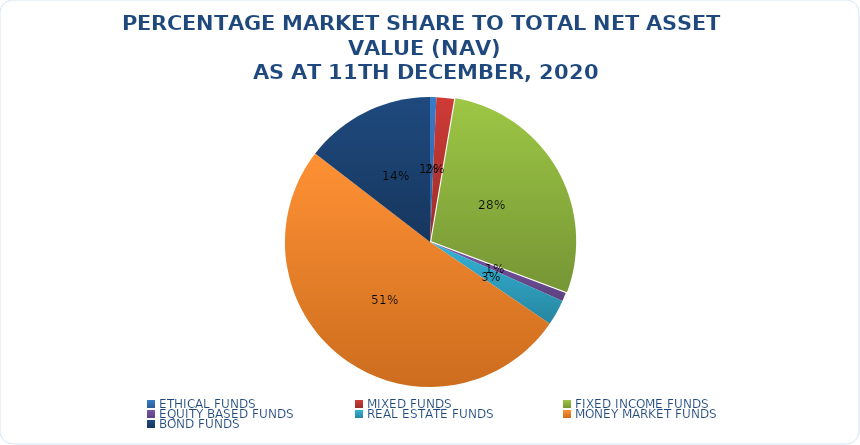
| Category | NET ASSET VALUE |
|---|---|
| ETHICAL FUNDS | 10366675105.88 |
| MIXED FUNDS | 28893069276.42 |
| FIXED INCOME FUNDS | 413717352736.787 |
| EQUITY BASED FUNDS | 14154102520.95 |
| REAL ESTATE FUNDS | 42249159096.869 |
| MONEY MARKET FUNDS | 750604159899.303 |
| BOND FUNDS | 214424096192.76 |